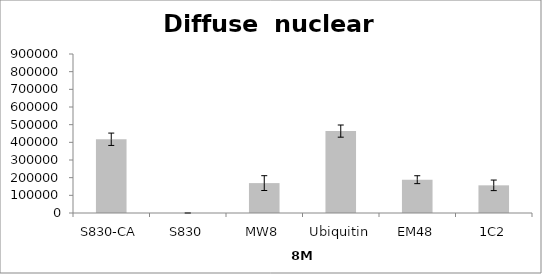
| Category | Series 0 |
|---|---|
| S830-CA | 417341.318 |
| S830 | 0 |
| MW8 | 169279.549 |
| Ubiquitin | 463590.731 |
| EM48 | 188577.942 |
| 1C2 | 156605.197 |